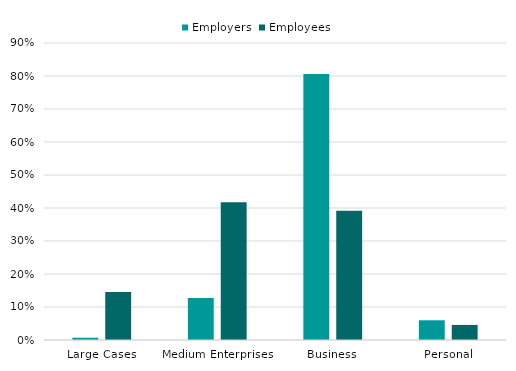
| Category | Employers | Employees |
|---|---|---|
| Large Cases | 0.007 | 0.145 |
| Medium Enterprises | 0.127 | 0.417 |
| Business | 0.806 | 0.392 |
| Personal | 0.06 | 0.046 |